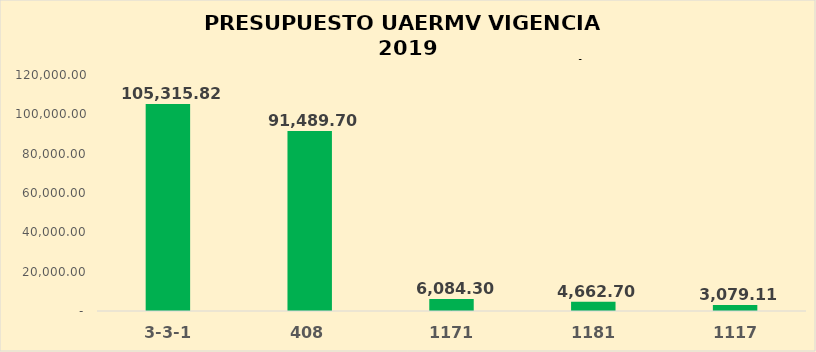
| Category | Series 0 |
|---|---|
| 3-3-1 | 105315.824 |
| 408 | 91489.704 |
| 1171 | 6084.304 |
| 1181 | 4662.704 |
| 1117 | 3079.112 |